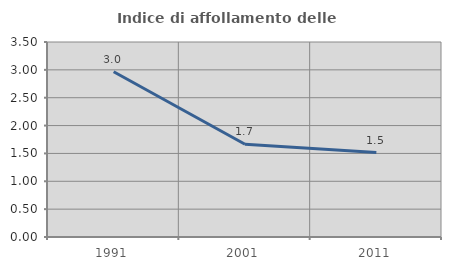
| Category | Indice di affollamento delle abitazioni  |
|---|---|
| 1991.0 | 2.965 |
| 2001.0 | 1.664 |
| 2011.0 | 1.515 |